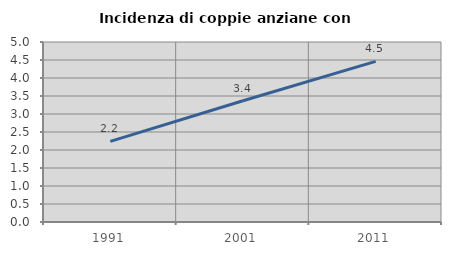
| Category | Incidenza di coppie anziane con figli |
|---|---|
| 1991.0 | 2.24 |
| 2001.0 | 3.369 |
| 2011.0 | 4.462 |